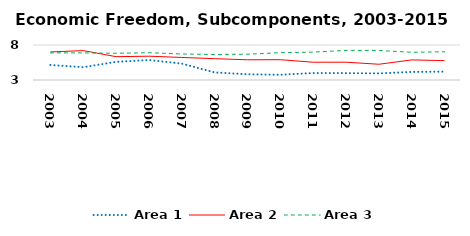
| Category | Area 1 | Area 2 | Area 3 |
|---|---|---|---|
| 2003.0 | 5.147 | 7.011 | 6.878 |
| 2004.0 | 4.827 | 7.199 | 6.871 |
| 2005.0 | 5.595 | 6.331 | 6.819 |
| 2006.0 | 5.853 | 6.4 | 6.897 |
| 2007.0 | 5.342 | 6.221 | 6.721 |
| 2008.0 | 4.082 | 6.048 | 6.643 |
| 2009.0 | 3.819 | 5.886 | 6.69 |
| 2010.0 | 3.75 | 5.9 | 6.897 |
| 2011.0 | 3.997 | 5.539 | 6.983 |
| 2012.0 | 3.982 | 5.544 | 7.233 |
| 2013.0 | 3.945 | 5.248 | 7.215 |
| 2014.0 | 4.154 | 5.87 | 6.962 |
| 2015.0 | 4.194 | 5.766 | 7.03 |